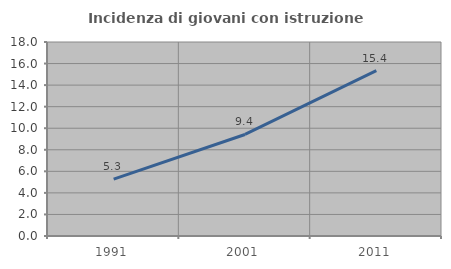
| Category | Incidenza di giovani con istruzione universitaria |
|---|---|
| 1991.0 | 5.28 |
| 2001.0 | 9.42 |
| 2011.0 | 15.353 |